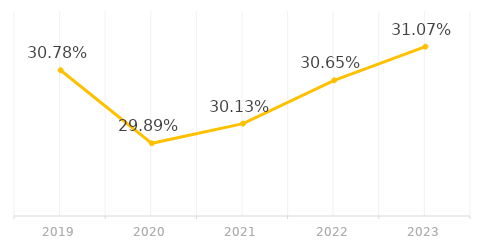
| Category | Series 0 |
|---|---|
| 2019.0 | 0.308 |
| 2020.0 | 0.299 |
| 2021.0 | 0.301 |
| 2022.0 | 0.307 |
| 2023.0 | 0.311 |